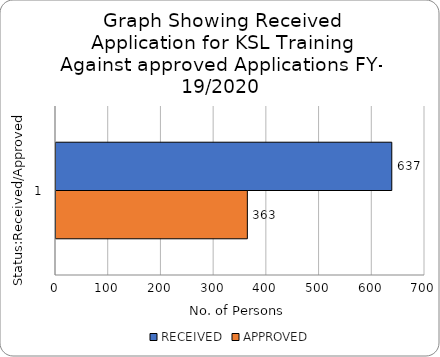
| Category | RECEIVED  | APPROVED |
|---|---|---|
| 0 | 637 | 363 |